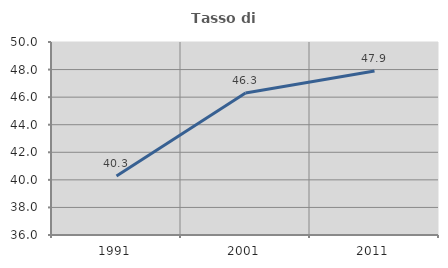
| Category | Tasso di occupazione   |
|---|---|
| 1991.0 | 40.278 |
| 2001.0 | 46.299 |
| 2011.0 | 47.899 |